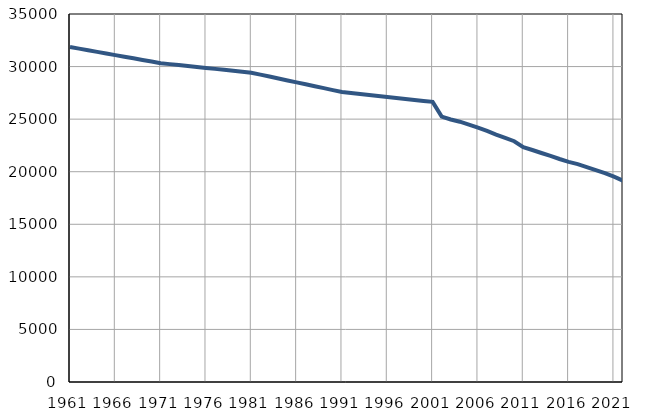
| Category | Број
становника |
|---|---|
| 1961.0 | 31860 |
| 1962.0 | 31706 |
| 1963.0 | 31552 |
| 1964.0 | 31399 |
| 1965.0 | 31245 |
| 1966.0 | 31091 |
| 1967.0 | 30937 |
| 1968.0 | 30783 |
| 1969.0 | 30630 |
| 1970.0 | 30475 |
| 1971.0 | 30322 |
| 1972.0 | 30232 |
| 1973.0 | 30141 |
| 1974.0 | 30051 |
| 1975.0 | 29960 |
| 1976.0 | 29870 |
| 1977.0 | 29780 |
| 1978.0 | 29689 |
| 1979.0 | 29599 |
| 1980.0 | 29508 |
| 1981.0 | 29418 |
| 1982.0 | 29234 |
| 1983.0 | 29050 |
| 1984.0 | 28866 |
| 1985.0 | 28682 |
| 1986.0 | 28499 |
| 1987.0 | 28315 |
| 1988.0 | 28131 |
| 1989.0 | 27947 |
| 1990.0 | 27763 |
| 1991.0 | 27579 |
| 1992.0 | 27485 |
| 1993.0 | 27392 |
| 1994.0 | 27298 |
| 1995.0 | 27204 |
| 1996.0 | 27110 |
| 1997.0 | 27017 |
| 1998.0 | 26923 |
| 1999.0 | 26829 |
| 2000.0 | 26735 |
| 2001.0 | 26642 |
| 2002.0 | 25236 |
| 2003.0 | 24969 |
| 2004.0 | 24756 |
| 2005.0 | 24486 |
| 2006.0 | 24199 |
| 2007.0 | 23880 |
| 2008.0 | 23532 |
| 2009.0 | 23217 |
| 2010.0 | 22899 |
| 2011.0 | 22333 |
| 2012.0 | 22065 |
| 2013.0 | 21778 |
| 2014.0 | 21506 |
| 2015.0 | 21211 |
| 2016.0 | 20939 |
| 2017.0 | 20720 |
| 2018.0 | 20445 |
| 2019.0 | 20144 |
| 2020.0 | 19858 |
| 2021.0 | 19525 |
| 2022.0 | 19146 |